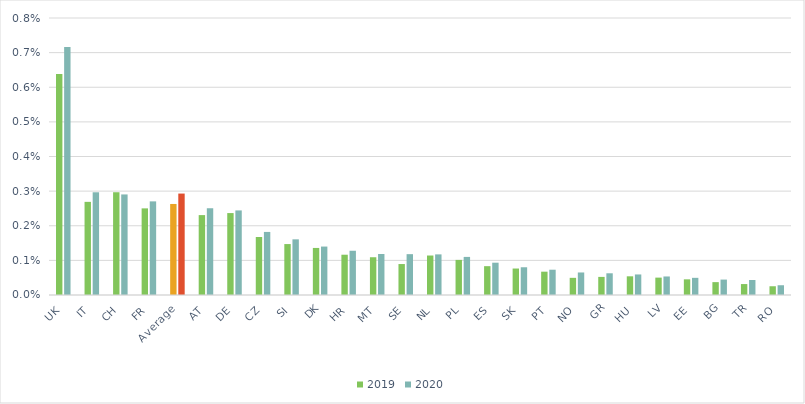
| Category | 2019 | 2020 |
|---|---|---|
| UK | 0.006 | 0.007 |
| IT | 0.003 | 0.003 |
| CH | 0.003 | 0.003 |
| FR | 0.003 | 0.003 |
| Average | 0.003 | 0.003 |
| AT | 0.002 | 0.003 |
| DE | 0.002 | 0.002 |
| CZ | 0.002 | 0.002 |
| SI | 0.001 | 0.002 |
| DK | 0.001 | 0.001 |
| HR | 0.001 | 0.001 |
| MT | 0.001 | 0.001 |
| SE | 0.001 | 0.001 |
| NL | 0.001 | 0.001 |
| PL | 0.001 | 0.001 |
| ES | 0.001 | 0.001 |
| SK | 0.001 | 0.001 |
| PT | 0.001 | 0.001 |
| NO | 0 | 0.001 |
| GR | 0.001 | 0.001 |
| HU | 0.001 | 0.001 |
| LV | 0.001 | 0.001 |
| EE | 0 | 0 |
| BG | 0 | 0 |
| TR | 0 | 0 |
| RO | 0 | 0 |